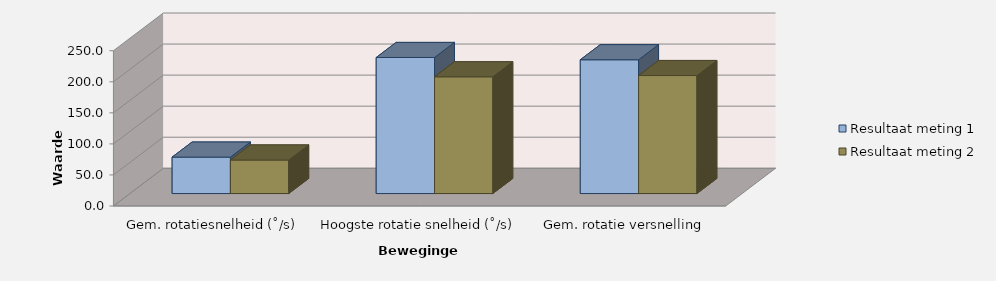
| Category | Resultaat meting 1 | Resultaat meting 2 |
|---|---|---|
| Gem. rotatiesnelheid (˚/s) | 58.671 | 54 |
| Hoogste rotatie snelheid (˚/s) | 219.068 | 188 |
| Gem. rotatie versnelling (˚/s^2 ) | 215.397 | 190 |